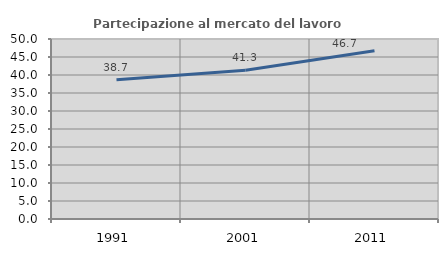
| Category | Partecipazione al mercato del lavoro  femminile |
|---|---|
| 1991.0 | 38.696 |
| 2001.0 | 41.315 |
| 2011.0 | 46.725 |